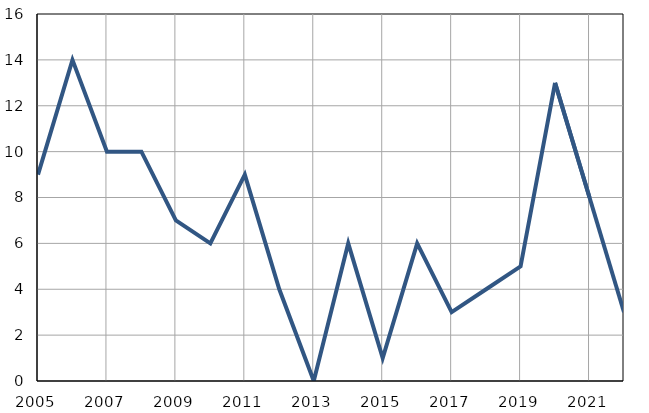
| Category | Infants
deaths |
|---|---|
| 2005.0 | 9 |
| 2006.0 | 14 |
| 2007.0 | 10 |
| 2008.0 | 10 |
| 2009.0 | 7 |
| 2010.0 | 6 |
| 2011.0 | 9 |
| 2012.0 | 4 |
| 2013.0 | 0 |
| 2014.0 | 6 |
| 2015.0 | 1 |
| 2016.0 | 6 |
| 2017.0 | 3 |
| 2018.0 | 4 |
| 2019.0 | 5 |
| 2020.0 | 13 |
| 2021.0 | 8 |
| 2022.0 | 3 |